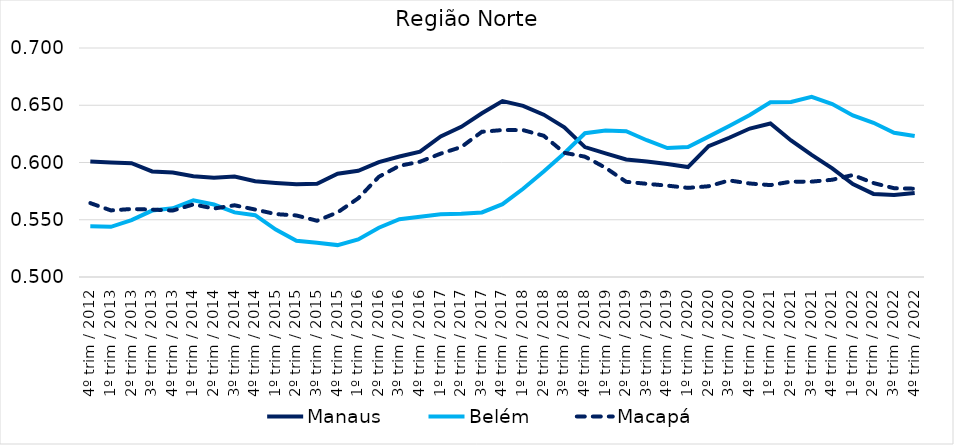
| Category | Manaus | Belém | Macapá |
|---|---|---|---|
| 4º trim / 2012 | 0.601 | 0.544 | 0.565 |
| 1º trim / 2013 | 0.6 | 0.544 | 0.558 |
| 2º trim / 2013 | 0.599 | 0.55 | 0.559 |
| 3º trim / 2013 | 0.592 | 0.558 | 0.559 |
| 4º trim / 2013 | 0.591 | 0.56 | 0.558 |
| 1º trim / 2014 | 0.588 | 0.567 | 0.563 |
| 2º trim / 2014 | 0.587 | 0.563 | 0.56 |
| 3º trim / 2014 | 0.588 | 0.556 | 0.563 |
| 4º trim / 2014 | 0.584 | 0.554 | 0.559 |
| 1º trim / 2015 | 0.582 | 0.541 | 0.555 |
| 2º trim / 2015 | 0.581 | 0.532 | 0.554 |
| 3º trim / 2015 | 0.581 | 0.53 | 0.549 |
| 4º trim / 2015 | 0.59 | 0.528 | 0.556 |
| 1º trim / 2016 | 0.593 | 0.533 | 0.569 |
| 2º trim / 2016 | 0.6 | 0.543 | 0.588 |
| 3º trim / 2016 | 0.605 | 0.55 | 0.597 |
| 4º trim / 2016 | 0.609 | 0.553 | 0.601 |
| 1º trim / 2017 | 0.623 | 0.555 | 0.608 |
| 2º trim / 2017 | 0.631 | 0.555 | 0.613 |
| 3º trim / 2017 | 0.643 | 0.556 | 0.627 |
| 4º trim / 2017 | 0.654 | 0.564 | 0.628 |
| 1º trim / 2018 | 0.65 | 0.577 | 0.628 |
| 2º trim / 2018 | 0.642 | 0.592 | 0.623 |
| 3º trim / 2018 | 0.631 | 0.608 | 0.608 |
| 4º trim / 2018 | 0.613 | 0.626 | 0.605 |
| 1º trim / 2019 | 0.608 | 0.628 | 0.595 |
| 2º trim / 2019 | 0.603 | 0.627 | 0.583 |
| 3º trim / 2019 | 0.601 | 0.619 | 0.581 |
| 4º trim / 2019 | 0.599 | 0.613 | 0.58 |
| 1º trim / 2020 | 0.596 | 0.613 | 0.578 |
| 2º trim / 2020 | 0.614 | 0.623 | 0.579 |
| 3º trim / 2020 | 0.622 | 0.632 | 0.584 |
| 4º trim / 2020 | 0.63 | 0.641 | 0.582 |
| 1º trim / 2021 | 0.634 | 0.653 | 0.58 |
| 2º trim / 2021 | 0.619 | 0.653 | 0.583 |
| 3º trim / 2021 | 0.607 | 0.657 | 0.583 |
| 4º trim / 2021 | 0.595 | 0.651 | 0.585 |
| 1º trim / 2022 | 0.581 | 0.641 | 0.589 |
| 2º trim / 2022 | 0.573 | 0.635 | 0.582 |
| 3º trim / 2022 | 0.572 | 0.626 | 0.578 |
| 4º trim / 2022 | 0.573 | 0.623 | 0.577 |